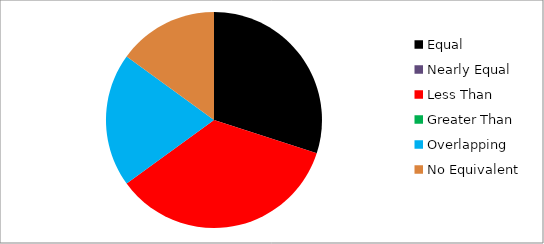
| Category | Series 0 |
|---|---|
| Equal | 6 |
| Nearly Equal | 0 |
| Less Than | 7 |
| Greater Than | 0 |
| Overlapping | 4 |
| No Equivalent | 3 |